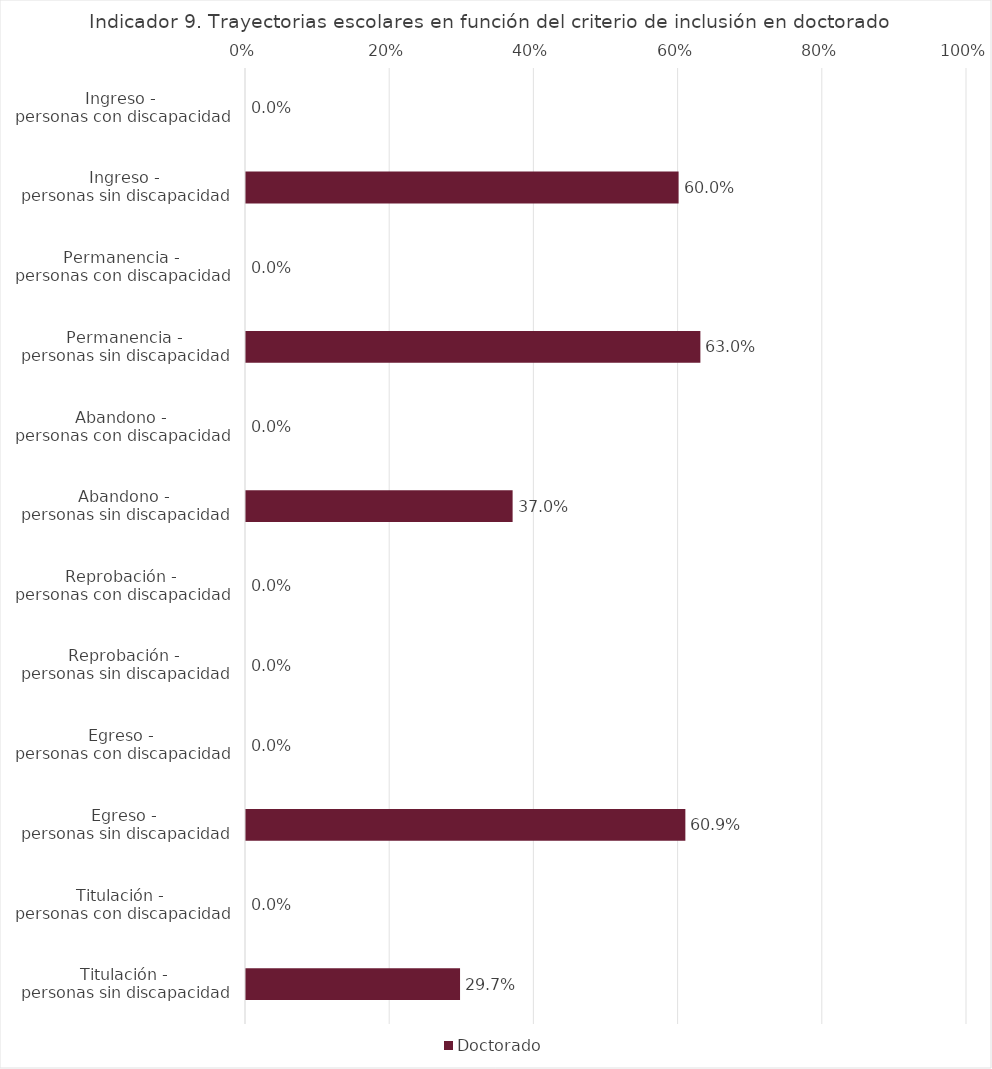
| Category | Doctorado |
|---|---|
| Ingreso - 
personas con discapacidad | 0 |
| Ingreso - 
personas sin discapacidad | 0.6 |
| Permanencia - 
personas con discapacidad | 0 |
| Permanencia - 
personas sin discapacidad | 0.63 |
| Abandono - 
personas con discapacidad | 0 |
| Abandono - 
personas sin discapacidad | 0.37 |
| Reprobación - 
personas con discapacidad | 0 |
| Reprobación - 
personas sin discapacidad | 0 |
| Egreso - 
personas con discapacidad | 0 |
| Egreso - 
personas sin discapacidad | 0.609 |
| Titulación - 
personas con discapacidad | 0 |
| Titulación - 
personas sin discapacidad | 0.297 |